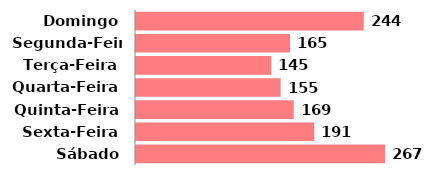
| Category | Qtde |
|---|---|
| Domingo | 244 |
| Segunda-Feira | 165 |
| Terça-Feira | 145 |
| Quarta-Feira | 155 |
| Quinta-Feira | 169 |
| Sexta-Feira | 191 |
| Sábado | 267 |